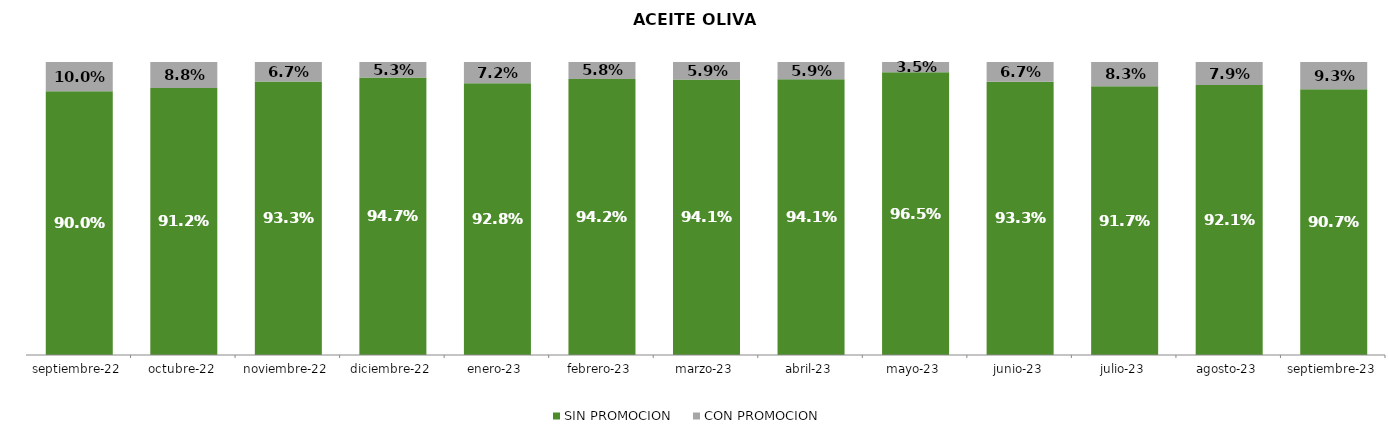
| Category | SIN PROMOCION   | CON PROMOCION   |
|---|---|---|
| 2022-09-01 | 0.9 | 0.1 |
| 2022-10-01 | 0.912 | 0.088 |
| 2022-11-01 | 0.933 | 0.067 |
| 2022-12-01 | 0.947 | 0.053 |
| 2023-01-01 | 0.928 | 0.072 |
| 2023-02-01 | 0.942 | 0.058 |
| 2023-03-01 | 0.941 | 0.059 |
| 2023-04-01 | 0.941 | 0.059 |
| 2023-05-01 | 0.965 | 0.035 |
| 2023-06-01 | 0.933 | 0.067 |
| 2023-07-01 | 0.917 | 0.083 |
| 2023-08-01 | 0.921 | 0.079 |
| 2023-09-01 | 0.907 | 0.093 |